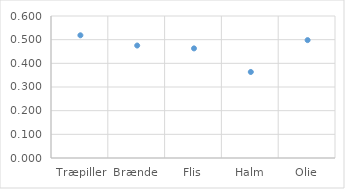
| Category | Series 0 |
|---|---|
| Træpiller | 0.518 |
| Brænde | 0.475 |
| Flis | 0.463 |
| Halm | 0.364 |
| Olie | 0.498 |